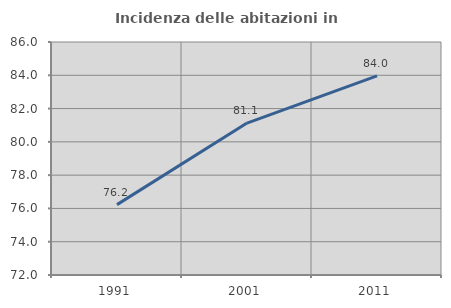
| Category | Incidenza delle abitazioni in proprietà  |
|---|---|
| 1991.0 | 76.228 |
| 2001.0 | 81.127 |
| 2011.0 | 83.966 |